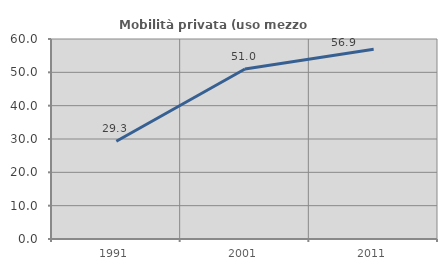
| Category | Mobilità privata (uso mezzo privato) |
|---|---|
| 1991.0 | 29.341 |
| 2001.0 | 50.998 |
| 2011.0 | 56.9 |